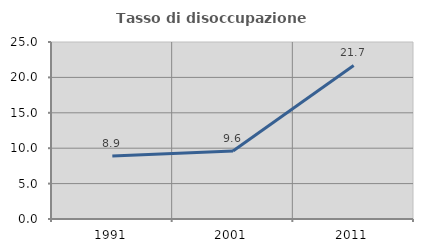
| Category | Tasso di disoccupazione giovanile  |
|---|---|
| 1991.0 | 8.896 |
| 2001.0 | 9.615 |
| 2011.0 | 21.687 |